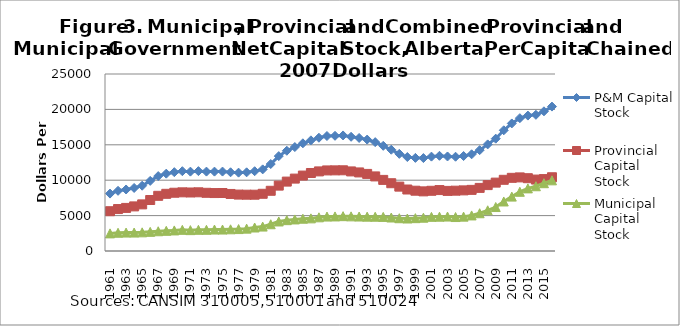
| Category | P&M Capital Stock | Provincial Capital Stock | Municipal Capital Stock |
|---|---|---|---|
| 1961.0 | 8108.859 | 5620.871 | 2487.988 |
| 1962.0 | 8501.826 | 5924.763 | 2577.064 |
| 1963.0 | 8687.099 | 6084.818 | 2602.281 |
| 1964.0 | 8902.797 | 6300 | 2602.797 |
| 1965.0 | 9220.69 | 6583.448 | 2637.241 |
| 1966.0 | 9903.636 | 7202.023 | 2701.613 |
| 1967.0 | 10581.879 | 7793.289 | 2788.591 |
| 1968.0 | 10922.572 | 8075.459 | 2847.113 |
| 1969.0 | 11134.702 | 8228.993 | 2905.709 |
| 1970.0 | 11272.1 | 8285.266 | 2986.834 |
| 1971.0 | 11210.788 | 8263.108 | 2947.68 |
| 1972.0 | 11279.802 | 8289.406 | 2990.396 |
| 1973.0 | 11213.526 | 8219.311 | 2994.215 |
| 1974.0 | 11212.678 | 8185.243 | 3027.434 |
| 1975.0 | 11219.729 | 8191.016 | 3028.713 |
| 1976.0 | 11120.283 | 8055.478 | 3064.805 |
| 1977.0 | 11065.754 | 7968.123 | 3097.631 |
| 1978.0 | 11111.93 | 7953.058 | 3158.872 |
| 1979.0 | 11268.661 | 7951.488 | 3317.173 |
| 1980.0 | 11529.286 | 8079.765 | 3449.521 |
| 1981.0 | 12282.725 | 8505.07 | 3777.655 |
| 1982.0 | 13403.51 | 9234.007 | 4169.503 |
| 1983.0 | 14157.413 | 9802.025 | 4355.388 |
| 1984.0 | 14682.275 | 10224.708 | 4457.567 |
| 1985.0 | 15211.542 | 10653.403 | 4558.139 |
| 1986.0 | 15627.248 | 11018.813 | 4608.435 |
| 1987.0 | 15999.987 | 11243.09 | 4756.897 |
| 1988.0 | 16241.461 | 11379.484 | 4861.977 |
| 1989.0 | 16270.902 | 11389.231 | 4881.671 |
| 1990.0 | 16320.824 | 11400.87 | 4919.954 |
| 1991.0 | 16130.812 | 11240.185 | 4890.626 |
| 1992.0 | 15965.149 | 11097.85 | 4867.298 |
| 1993.0 | 15736.935 | 10888.197 | 4848.738 |
| 1994.0 | 15373.587 | 10535.783 | 4837.803 |
| 1995.0 | 14858.555 | 10042.717 | 4815.838 |
| 1996.0 | 14303.459 | 9572.875 | 4730.584 |
| 1997.0 | 13720.878 | 9091.301 | 4629.577 |
| 1998.0 | 13273.93 | 8684.521 | 4589.409 |
| 1999.0 | 13153.082 | 8515.958 | 4637.124 |
| 2000.0 | 13125.633 | 8423.546 | 4702.087 |
| 2001.0 | 13327.626 | 8504.018 | 4823.609 |
| 2002.0 | 13448.042 | 8606.057 | 4841.986 |
| 2003.0 | 13350.919 | 8488.613 | 4862.306 |
| 2004.0 | 13315.271 | 8518.747 | 4796.524 |
| 2005.0 | 13415.67 | 8561.74 | 4853.931 |
| 2006.0 | 13660.353 | 8635.452 | 5024.901 |
| 2007.0 | 14245.463 | 8913.41 | 5332.053 |
| 2008.0 | 15056.087 | 9307.642 | 5748.445 |
| 2009.0 | 15866.143 | 9657.818 | 6208.325 |
| 2010.0 | 17050.169 | 10056.334 | 6993.835 |
| 2011.0 | 18017.034 | 10333.252 | 7683.782 |
| 2012.0 | 18758.979 | 10395.658 | 8363.321 |
| 2013.0 | 19125.802 | 10282.52 | 8843.282 |
| 2014.0 | 19234.907 | 10090.02 | 9144.887 |
| 2015.0 | 19730.573 | 10156.727 | 9573.846 |
| 2016.0 | 20396.443 | 10415.27 | 9981.173 |